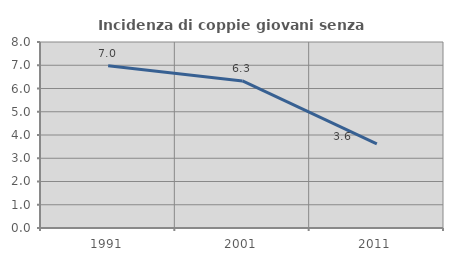
| Category | Incidenza di coppie giovani senza figli |
|---|---|
| 1991.0 | 6.977 |
| 2001.0 | 6.326 |
| 2011.0 | 3.622 |